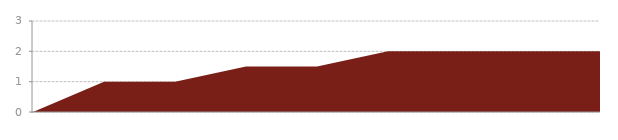
| Category | Series 0 |
|---|---|
| 0 | 0 |
| 1 | 1 |
| 2 | 1 |
| 3 | 1.5 |
| 4 | 1.5 |
| 5 | 2 |
| 6 | 2 |
| 7 | 2 |
| 8 | 2 |